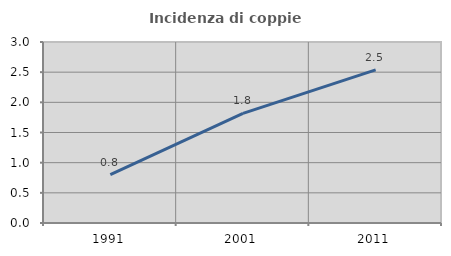
| Category | Incidenza di coppie miste |
|---|---|
| 1991.0 | 0.8 |
| 2001.0 | 1.818 |
| 2011.0 | 2.538 |